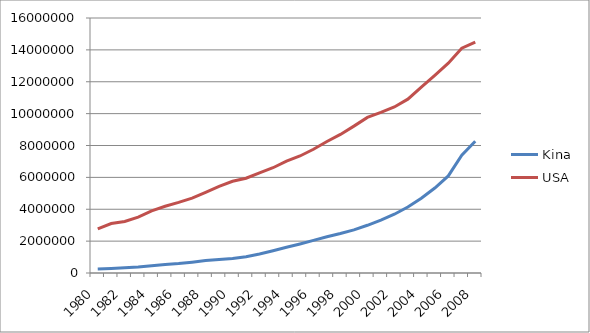
| Category | Kina | USA |
|---|---|---|
| 1980.0 | 246779 | 2768900 |
| 1981.0 | 283996 | 3105400 |
| 1982.0 | 328711 | 3229500 |
| 1983.0 | 378957 | 3508800 |
| 1984.0 | 452951 | 3902600 |
| 1985.0 | 529880 | 4187500 |
| 1986.0 | 589362 | 4427700 |
| 1987.0 | 675888 | 4702100 |
| 1988.0 | 778067 | 5063900 |
| 1989.0 | 840702 | 5441700 |
| 1990.0 | 906401 | 5757200 |
| 1991.0 | 1024393 | 5946900 |
| 1992.0 | 1196795 | 6286800 |
| 1993.0 | 1395692 | 6604300 |
| 1994.0 | 1611819 | 7017500 |
| 1995.0 | 1823959 | 7342300 |
| 1996.0 | 2044551 | 7762300 |
| 1997.0 | 2272021 | 8250900 |
| 1998.0 | 2476451 | 8694600 |
| 1999.0 | 2703164 | 9216200 |
| 2000.0 | 2994105 | 9764800 |
| 2001.0 | 3320724 | 10075900 |
| 2002.0 | 3686312 | 10417600 |
| 2003.0 | 4141356 | 10908000 |
| 2004.0 | 4688989 | 11657300 |
| 2005.0 | 5333233 | 12397900 |
| 2006.0 | 6091977 | 13163870 |
| 2007.0 | 7386000 | 14102000 |
| 2008.0 | 8263000 | 14488000 |